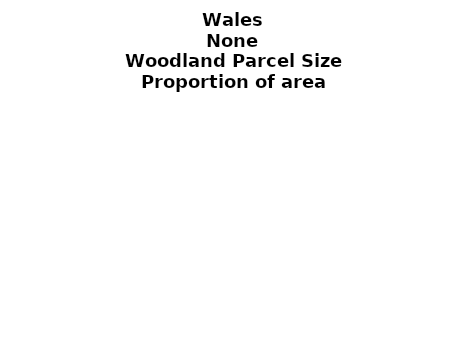
| Category | None |
|---|---|
| <5 ha | 0 |
| ≥5 and <10 ha | 0 |
| ≥10 and <15 ha | 0 |
| ≥15 and <20 ha | 0 |
| ≥20 and <25 ha | 0 |
| ≥25 and <30 ha | 0 |
| ≥30 and <35 ha | 0 |
| ≥35 and <40 ha | 0 |
| ≥40 and <45 ha | 0 |
| ≥45 and <50 ha | 0 |
| ≥50 and <60 ha | 0 |
| ≥60 and <70 ha | 0 |
| ≥70 and <80 ha | 0 |
| ≥80 and <90 ha | 0 |
| ≥90 and <100 ha | 0 |
| ≥100 and <150 ha | 0 |
| ≥150 and <200 ha | 0 |
| ≥200 ha | 0 |